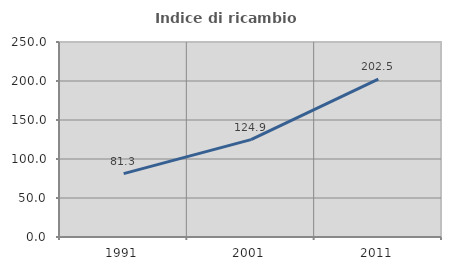
| Category | Indice di ricambio occupazionale  |
|---|---|
| 1991.0 | 81.25 |
| 2001.0 | 124.87 |
| 2011.0 | 202.5 |